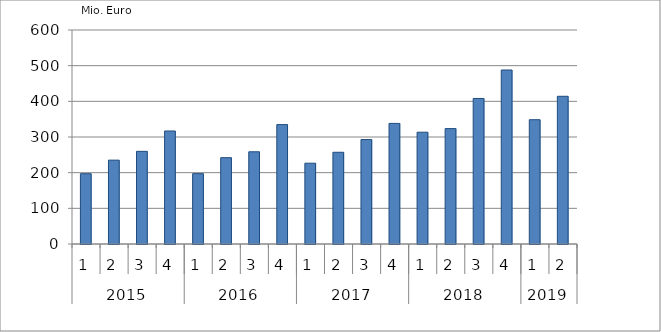
| Category | Ausbaugewerblicher Umsatz3 |
|---|---|
| 0 | 197030.42 |
| 1 | 235094.994 |
| 2 | 259758.438 |
| 3 | 316833.232 |
| 4 | 197219.532 |
| 5 | 242069.899 |
| 6 | 258547.84 |
| 7 | 334764.305 |
| 8 | 226552.317 |
| 9 | 257191.13 |
| 10 | 292853.372 |
| 11 | 338154.691 |
| 12 | 313433.569 |
| 13 | 323547.694 |
| 14 | 408057.42 |
| 15 | 487843.765 |
| 16 | 348466.115 |
| 17 | 414145.554 |